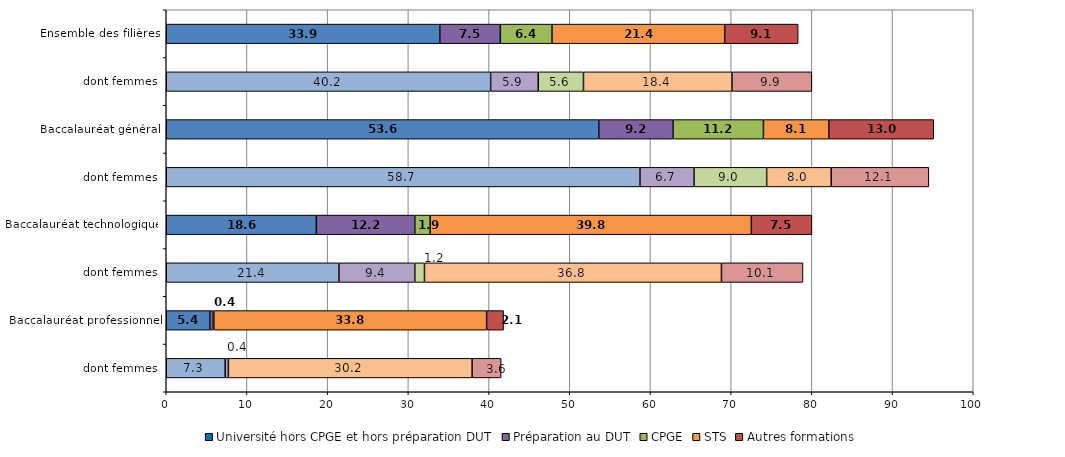
| Category | Université hors CPGE et hors préparation DUT | Préparation au DUT | CPGE | STS | Autres formations |
|---|---|---|---|---|---|
| dont femmes | 7.3 | 0.4 | 0 | 30.2 | 3.6 |
| Baccalauréat professionnel | 5.4 | 0.4 | 0.1 | 33.8 | 2.1 |
| dont femmes | 21.4 | 9.4 | 1.2 | 36.8 | 10.1 |
| Baccalauréat technologique | 18.6 | 12.2 | 1.9 | 39.8 | 7.5 |
| dont femmes | 58.7 | 6.7 | 9 | 8 | 12.1 |
| Baccalauréat général | 53.6 | 9.2 | 11.2 | 8.1 | 13 |
| dont femmes | 40.2 | 5.9 | 5.6 | 18.4 | 9.9 |
| Ensemble des filières | 33.9 | 7.5 | 6.4 | 21.4 | 9.1 |